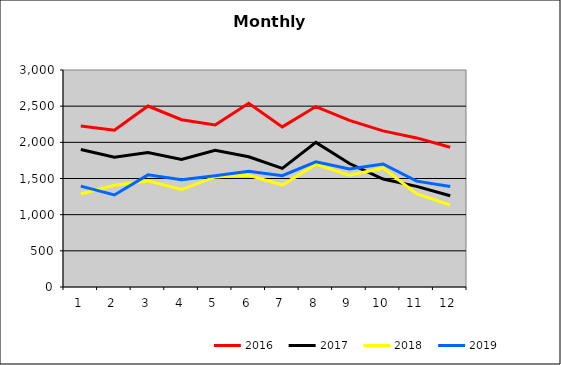
| Category | 2016 | 2017 | 2018 | 2019 |
|---|---|---|---|---|
| 0 | 2226.188 | 1900.859 | 1286.21 | 1394.576 |
| 1 | 2166.497 | 1795.105 | 1406.556 | 1272.617 |
| 2 | 2501.903 | 1859.386 | 1466.695 | 1550.042 |
| 3 | 2312.349 | 1764.013 | 1347.408 | 1482.121 |
| 4 | 2240.561 | 1891.399 | 1522.181 | 1539.379 |
| 5 | 2540.235 | 1800.236 | 1543.945 | 1598.892 |
| 6 | 2213.485 | 1640.121 | 1409.491 | 1538.112 |
| 7 | 2494.361 | 1999.331 | 1694.901 | 1729.426 |
| 8 | 2304.009 | 1706.874 | 1545.104 | 1631.933 |
| 9 | 2158.544 | 1492.036 | 1642.816 | 1701.214 |
| 10 | 2060.966 | 1390.86 | 1288.934 | 1463.951 |
| 11 | 1932.97 | 1261.902 | 1131.485 | 1390.399 |